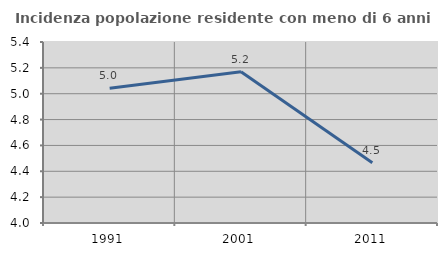
| Category | Incidenza popolazione residente con meno di 6 anni |
|---|---|
| 1991.0 | 5.042 |
| 2001.0 | 5.169 |
| 2011.0 | 4.466 |